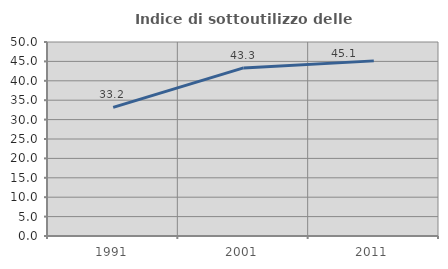
| Category | Indice di sottoutilizzo delle abitazioni  |
|---|---|
| 1991.0 | 33.161 |
| 2001.0 | 43.329 |
| 2011.0 | 45.136 |